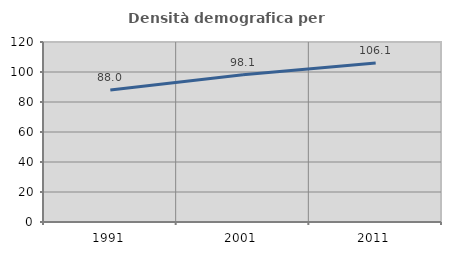
| Category | Densità demografica |
|---|---|
| 1991.0 | 88.031 |
| 2001.0 | 98.148 |
| 2011.0 | 106.056 |